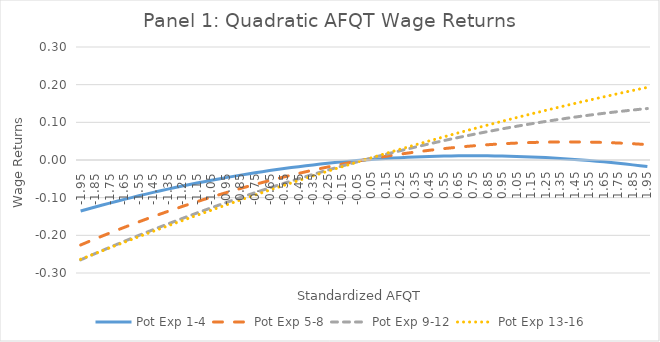
| Category | Pot Exp 1-4 | Pot Exp 5-8 | Pot Exp 9-12 | Pot Exp 13-16 |
|---|---|---|---|---|
| -1.95 | -0.135 | -0.226 | -0.265 | -0.264 |
| -1.9 | -0.13 | -0.217 | -0.257 | -0.256 |
| -1.8499999999999999 | -0.125 | -0.21 | -0.248 | -0.248 |
| -1.7999999999999998 | -0.119 | -0.202 | -0.24 | -0.241 |
| -1.7499999999999998 | -0.114 | -0.194 | -0.232 | -0.233 |
| -1.6999999999999997 | -0.109 | -0.186 | -0.224 | -0.226 |
| -1.6499999999999997 | -0.105 | -0.179 | -0.216 | -0.218 |
| -1.5999999999999996 | -0.1 | -0.171 | -0.208 | -0.211 |
| -1.5499999999999996 | -0.095 | -0.164 | -0.2 | -0.204 |
| -1.4999999999999996 | -0.091 | -0.157 | -0.193 | -0.196 |
| -1.4499999999999995 | -0.086 | -0.15 | -0.185 | -0.189 |
| -1.3999999999999995 | -0.082 | -0.143 | -0.177 | -0.182 |
| -1.3499999999999994 | -0.077 | -0.136 | -0.17 | -0.175 |
| -1.2999999999999994 | -0.073 | -0.13 | -0.162 | -0.168 |
| -1.2499999999999993 | -0.069 | -0.123 | -0.155 | -0.161 |
| -1.1999999999999993 | -0.065 | -0.117 | -0.148 | -0.154 |
| -1.1499999999999992 | -0.061 | -0.111 | -0.141 | -0.147 |
| -1.0999999999999992 | -0.058 | -0.105 | -0.134 | -0.14 |
| -1.0499999999999992 | -0.054 | -0.099 | -0.127 | -0.133 |
| -0.9999999999999991 | -0.05 | -0.093 | -0.12 | -0.126 |
| -0.9499999999999991 | -0.047 | -0.087 | -0.113 | -0.12 |
| -0.899999999999999 | -0.043 | -0.081 | -0.106 | -0.113 |
| -0.849999999999999 | -0.04 | -0.076 | -0.1 | -0.106 |
| -0.7999999999999989 | -0.037 | -0.07 | -0.093 | -0.1 |
| -0.7499999999999989 | -0.034 | -0.065 | -0.087 | -0.093 |
| -0.6999999999999988 | -0.031 | -0.06 | -0.08 | -0.086 |
| -0.6499999999999988 | -0.028 | -0.055 | -0.074 | -0.08 |
| -0.5999999999999988 | -0.025 | -0.05 | -0.068 | -0.074 |
| -0.5499999999999987 | -0.023 | -0.045 | -0.062 | -0.067 |
| -0.4999999999999987 | -0.02 | -0.04 | -0.056 | -0.061 |
| -0.44999999999999873 | -0.018 | -0.036 | -0.05 | -0.055 |
| -0.39999999999999875 | -0.015 | -0.031 | -0.044 | -0.048 |
| -0.34999999999999876 | -0.013 | -0.027 | -0.038 | -0.042 |
| -0.29999999999999877 | -0.011 | -0.023 | -0.032 | -0.036 |
| -0.24999999999999878 | -0.009 | -0.019 | -0.027 | -0.03 |
| -0.1999999999999988 | -0.007 | -0.015 | -0.021 | -0.024 |
| -0.1499999999999988 | -0.005 | -0.011 | -0.016 | -0.018 |
| -0.0999999999999988 | -0.003 | -0.007 | -0.01 | -0.012 |
| -0.049999999999998795 | -0.002 | -0.003 | -0.005 | -0.006 |
| 0.0 | 0 | 0 | 0 | 0 |
| 0.05 | 0.001 | 0.003 | 0.005 | 0.006 |
| 0.1 | 0.003 | 0.007 | 0.01 | 0.012 |
| 0.15000000000000002 | 0.004 | 0.01 | 0.015 | 0.017 |
| 0.2 | 0.005 | 0.013 | 0.02 | 0.023 |
| 0.25 | 0.006 | 0.016 | 0.025 | 0.029 |
| 0.3 | 0.007 | 0.018 | 0.029 | 0.034 |
| 0.35 | 0.008 | 0.021 | 0.034 | 0.04 |
| 0.39999999999999997 | 0.009 | 0.023 | 0.038 | 0.045 |
| 0.44999999999999996 | 0.01 | 0.026 | 0.043 | 0.051 |
| 0.49999999999999994 | 0.01 | 0.028 | 0.047 | 0.056 |
| 0.5499999999999999 | 0.011 | 0.03 | 0.052 | 0.062 |
| 0.6 | 0.011 | 0.032 | 0.056 | 0.067 |
| 0.65 | 0.011 | 0.034 | 0.06 | 0.072 |
| 0.7000000000000001 | 0.011 | 0.036 | 0.064 | 0.077 |
| 0.7500000000000001 | 0.011 | 0.038 | 0.068 | 0.083 |
| 0.8000000000000002 | 0.011 | 0.039 | 0.072 | 0.088 |
| 0.8500000000000002 | 0.011 | 0.04 | 0.075 | 0.093 |
| 0.9000000000000002 | 0.011 | 0.042 | 0.079 | 0.098 |
| 0.9500000000000003 | 0.011 | 0.043 | 0.083 | 0.103 |
| 1.0000000000000002 | 0.01 | 0.044 | 0.086 | 0.108 |
| 1.0500000000000003 | 0.01 | 0.045 | 0.09 | 0.113 |
| 1.1000000000000003 | 0.009 | 0.046 | 0.093 | 0.117 |
| 1.1500000000000004 | 0.008 | 0.046 | 0.096 | 0.122 |
| 1.2000000000000004 | 0.007 | 0.047 | 0.099 | 0.127 |
| 1.2500000000000004 | 0.006 | 0.047 | 0.102 | 0.132 |
| 1.3000000000000005 | 0.005 | 0.048 | 0.105 | 0.136 |
| 1.3500000000000005 | 0.004 | 0.048 | 0.108 | 0.141 |
| 1.4000000000000006 | 0.003 | 0.048 | 0.111 | 0.146 |
| 1.4500000000000006 | 0.002 | 0.048 | 0.114 | 0.15 |
| 1.5000000000000007 | 0 | 0.048 | 0.116 | 0.155 |
| 1.5500000000000007 | -0.001 | 0.047 | 0.119 | 0.159 |
| 1.6000000000000008 | -0.003 | 0.047 | 0.122 | 0.163 |
| 1.6500000000000008 | -0.005 | 0.047 | 0.124 | 0.168 |
| 1.7000000000000008 | -0.007 | 0.046 | 0.126 | 0.172 |
| 1.7500000000000009 | -0.009 | 0.045 | 0.128 | 0.176 |
| 1.800000000000001 | -0.011 | 0.044 | 0.131 | 0.18 |
| 1.850000000000001 | -0.013 | 0.043 | 0.133 | 0.185 |
| 1.900000000000001 | -0.015 | 0.042 | 0.135 | 0.189 |
| 1.950000000000001 | -0.018 | 0.041 | 0.137 | 0.193 |